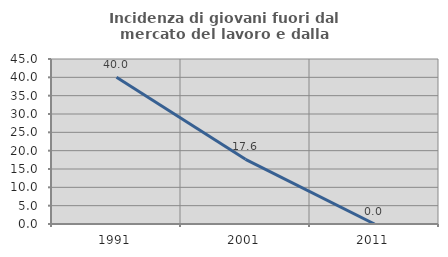
| Category | Incidenza di giovani fuori dal mercato del lavoro e dalla formazione  |
|---|---|
| 1991.0 | 40 |
| 2001.0 | 17.647 |
| 2011.0 | 0 |